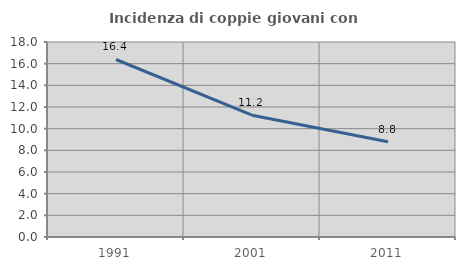
| Category | Incidenza di coppie giovani con figli |
|---|---|
| 1991.0 | 16.386 |
| 2001.0 | 11.247 |
| 2011.0 | 8.787 |